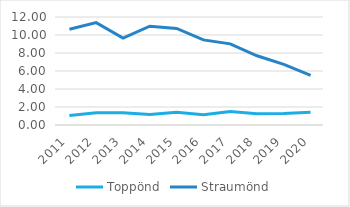
| Category | Toppönd | Straumönd |
|---|---|---|
| 2011.0 | 1.065 | 10.639 |
| 2012.0 | 1.366 | 11.374 |
| 2013.0 | 1.363 | 9.654 |
| 2014.0 | 1.159 | 10.979 |
| 2015.0 | 1.423 | 10.725 |
| 2016.0 | 1.132 | 9.455 |
| 2017.0 | 1.486 | 9.016 |
| 2018.0 | 1.261 | 7.689 |
| 2019.0 | 1.271 | 6.733 |
| 2020.0 | 1.416 | 5.504 |